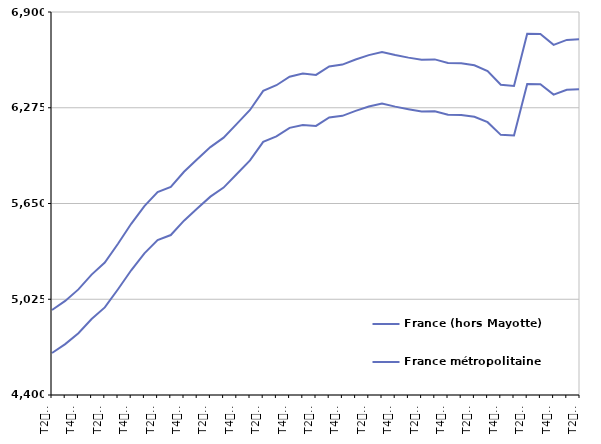
| Category | France (hors Mayotte) | France métropolitaine |
|---|---|---|
| T2
2011 | 4954.9 | 4674 |
| T3
2011 | 5014.1 | 4732 |
| T4
2011 | 5089.3 | 4803.3 |
| T1
2012 | 5185.8 | 4895.7 |
| T2
2012 | 5264.9 | 4971.6 |
| T3
2012 | 5387.5 | 5090.2 |
| T4
2012 | 5517.4 | 5214.1 |
| T1
2013 | 5632.5 | 5324.8 |
| T2
2013 | 5724 | 5411.2 |
| T3
2013 | 5758.2 | 5444.2 |
| T4
2013 | 5857.2 | 5538.1 |
| T1
2014 | 5939.2 | 5617.3 |
| T2
2014 | 6018.3 | 5694.7 |
| T3
2014 | 6079.7 | 5753.9 |
| T4
2014 | 6170.1 | 5842.8 |
| T1
2015 | 6260.5 | 5931.3 |
| T2
2015 | 6385.5 | 6052 |
| T3
2015 | 6422 | 6087.7 |
| T4
2015 | 6477.6 | 6143.5 |
| T1
2016 | 6498 | 6162.7 |
| T2
2016 | 6489 | 6156.2 |
| T3
2016 | 6544.6 | 6211.4 |
| T4
2016 | 6556.7 | 6222.1 |
| T1
2017 | 6590.2 | 6254.4 |
| T2
2017 | 6618.5 | 6282.8 |
| T3
2017 | 6638.5 | 6302.5 |
| T4
2017 | 6619 | 6282.4 |
| T1
2018 | 6602.2 | 6265.5 |
| T2
2018 | 6589.1 | 6250.5 |
| T3
2018 | 6590.7 | 6252.7 |
| T4
2018 | 6566.9 | 6229.6 |
| T1
2019 | 6565.5 | 6228.1 |
| T2
2019 | 6552.1 | 6216.5 |
| T3
2019 | 6513.9 | 6180.9 |
| T4
2019 | 6424.8 | 6098.1 |
| T1
2020 | 6416.8 | 6094.5 |
| T2
2020 | 6757.3 | 6430.5 |
| T3
2020 | 6756.3 | 6428.8 |
| T4
2020 | 6685.3 | 6361 |
| T1
2021 | 6717.8 | 6392.8 |
| T2
2021 | 6722.4 | 6396.5 |